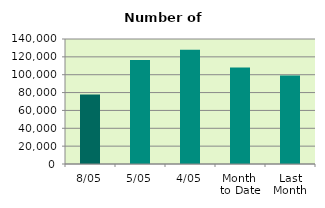
| Category | Series 0 |
|---|---|
| 8/05 | 77724 |
| 5/05 | 116560 |
| 4/05 | 127990 |
| Month 
to Date | 108108.4 |
| Last
Month | 99222.444 |